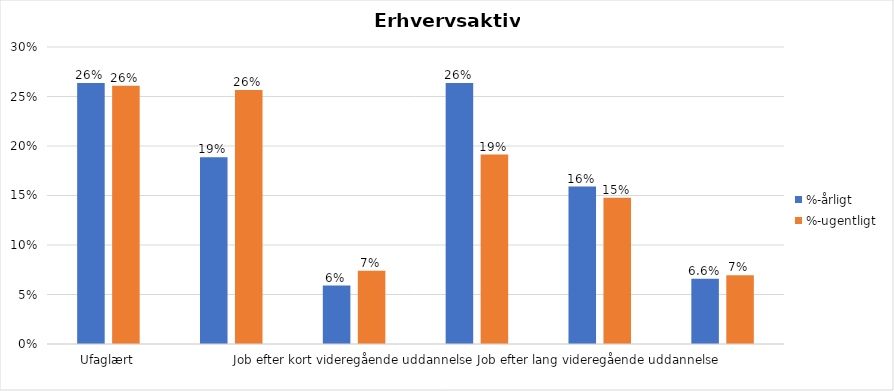
| Category | %-årligt | %-ugentligt |
|---|---|---|
| Ufaglært | 0.264 | 0.261 |
| Erhvervsfagligt job | 0.189 | 0.257 |
| Job efter kort videregående uddannelse | 0.059 | 0.074 |
| Job efter mellemlang videregående uddannelse | 0.264 | 0.191 |
| Job efter lang videregående uddannelse | 0.159 | 0.148 |
| Selvstændig | 0.066 | 0.07 |